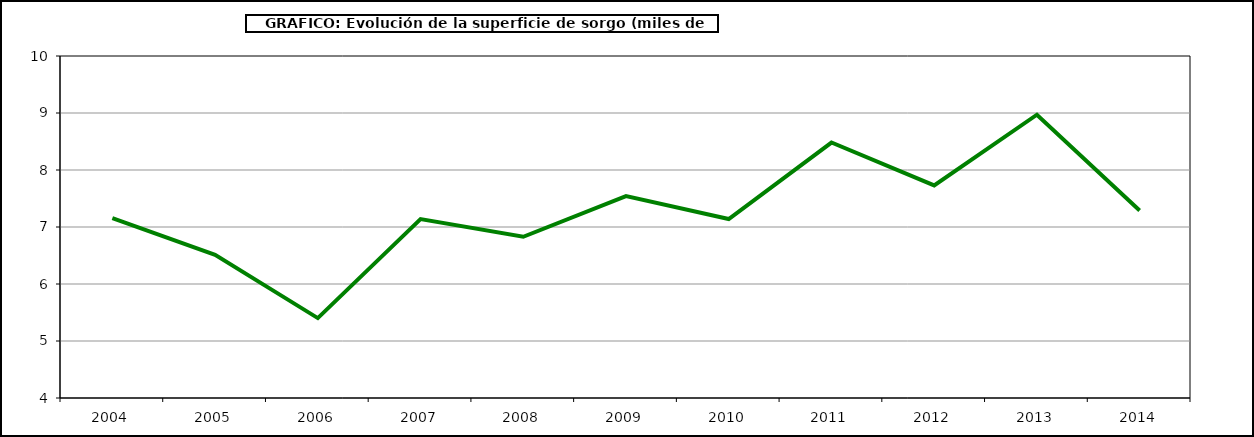
| Category | Superficie |
|---|---|
| 2004.0 | 7.156 |
| 2005.0 | 6.511 |
| 2006.0 | 5.402 |
| 2007.0 | 7.14 |
| 2008.0 | 6.829 |
| 2009.0 | 7.541 |
| 2010.0 | 7.14 |
| 2011.0 | 8.482 |
| 2012.0 | 7.729 |
| 2013.0 | 8.97 |
| 2014.0 | 7.288 |